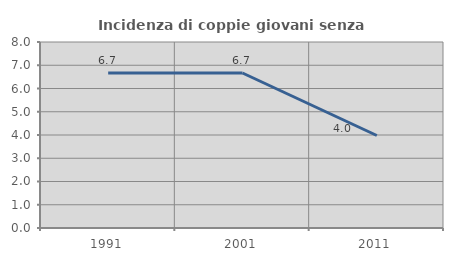
| Category | Incidenza di coppie giovani senza figli |
|---|---|
| 1991.0 | 6.667 |
| 2001.0 | 6.667 |
| 2011.0 | 3.979 |